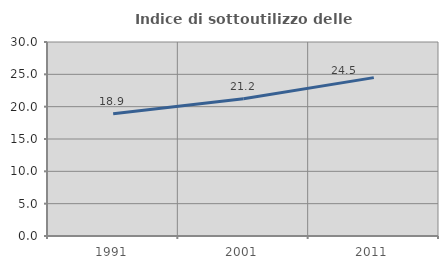
| Category | Indice di sottoutilizzo delle abitazioni  |
|---|---|
| 1991.0 | 18.914 |
| 2001.0 | 21.226 |
| 2011.0 | 24.489 |